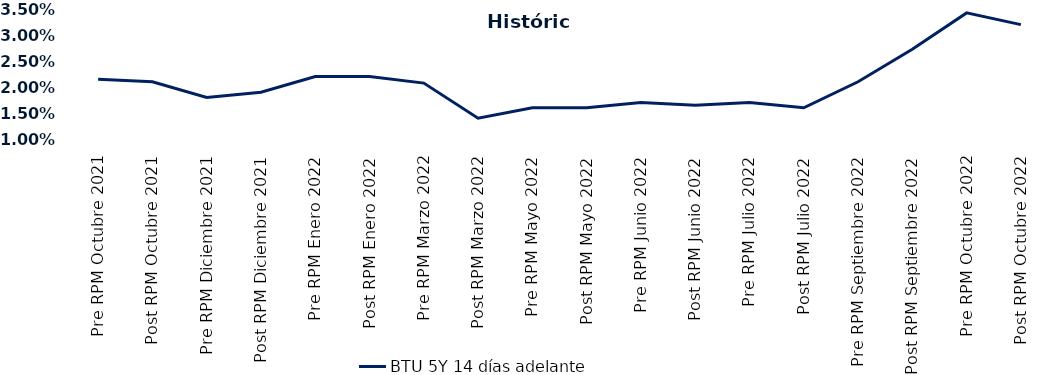
| Category | BTU 5Y 14 días adelante |
|---|---|
| Pre RPM Octubre 2021 | 0.022 |
| Post RPM Octubre 2021 | 0.021 |
| Pre RPM Diciembre 2021 | 0.018 |
| Post RPM Diciembre 2021 | 0.019 |
| Pre RPM Enero 2022 | 0.022 |
| Post RPM Enero 2022 | 0.022 |
| Pre RPM Marzo 2022 | 0.021 |
| Post RPM Marzo 2022 | 0.014 |
| Pre RPM Mayo 2022 | 0.016 |
| Post RPM Mayo 2022 | 0.016 |
| Pre RPM Junio 2022 | 0.017 |
| Post RPM Junio 2022 | 0.016 |
| Pre RPM Julio 2022 | 0.017 |
| Post RPM Julio 2022 | 0.016 |
| Pre RPM Septiembre 2022 | 0.021 |
| Post RPM Septiembre 2022 | 0.027 |
| Pre RPM Octubre 2022 | 0.034 |
| Post RPM Octubre 2022 | 0.032 |